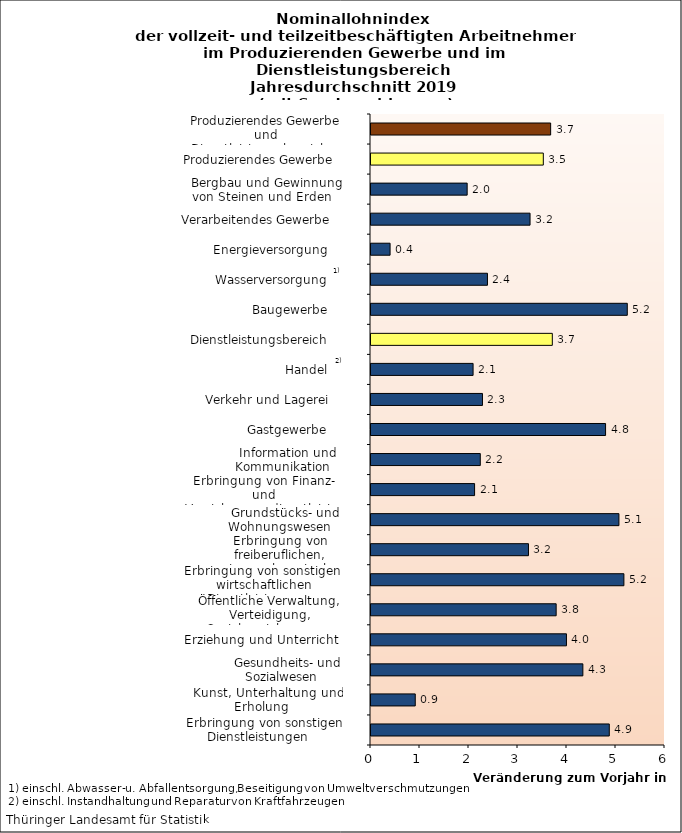
| Category | Series 0 |
|---|---|
| Erbringung von sonstigen Dienstleistungen    | 4.863 |
| Kunst, Unterhaltung und Erholung    | 0.903 |
| Gesundheits- und Sozialwesen    | 4.324 |
| Erziehung und Unterricht    | 3.989 |
| Öffentliche Verwaltung, Verteidigung, Sozialversicherung    | 3.779 |
| Erbringung von sonstigen  wirtschaftlichen Dienstleistungen    | 5.161 |
| Erbringung von freiberuflichen, wissensch. u. techn. Dienstleistungen    | 3.214 |
| Grundstücks- und Wohnungswesen    | 5.06 |
| Erbringung von Finanz- und Versicherungsdienstleistungen    | 2.114 |
| Information und Kommunikation    | 2.23 |
| Gastgewerbe    | 4.787 |
| Verkehr und Lagerei    | 2.275 |
| Handel    | 2.083 |
| Dienstleistungsbereich    | 3.7 |
| Baugewerbe    | 5.23 |
| Wasserversorgung    | 2.377 |
| Energieversorgung    | 0.389 |
| Verarbeitendes Gewerbe    | 3.246 |
| Bergbau und Gewinnung von Steinen und Erden    | 1.963 |
| Produzierendes Gewerbe    | 3.517 |
| Produzierendes Gewerbe und Dienstleistungsbereich    | 3.666 |